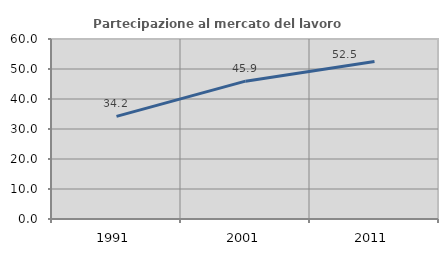
| Category | Partecipazione al mercato del lavoro  femminile |
|---|---|
| 1991.0 | 34.211 |
| 2001.0 | 45.946 |
| 2011.0 | 52.486 |